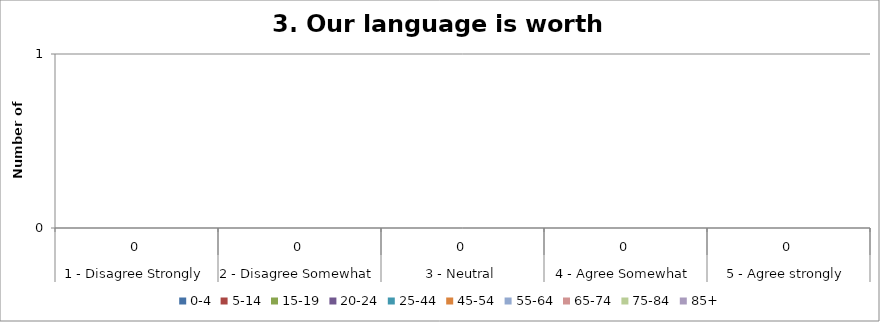
| Category | 0-4 | 5-14 | 15-19 | 20-24 | 25-44 | 45-54 | 55-64 | 65-74 | 75-84 | 85+ |
|---|---|---|---|---|---|---|---|---|---|---|
| 0 | 0 | 0 | 0 | 0 | 0 | 0 | 0 | 0 | 0 | 0 |
| 1 | 0 | 0 | 0 | 0 | 0 | 0 | 0 | 0 | 0 | 0 |
| 2 | 0 | 0 | 0 | 0 | 0 | 0 | 0 | 0 | 0 | 0 |
| 3 | 0 | 0 | 0 | 0 | 0 | 0 | 0 | 0 | 0 | 0 |
| 4 | 0 | 0 | 0 | 0 | 0 | 0 | 0 | 0 | 0 | 0 |